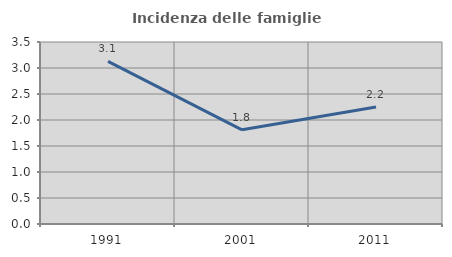
| Category | Incidenza delle famiglie numerose |
|---|---|
| 1991.0 | 3.129 |
| 2001.0 | 1.812 |
| 2011.0 | 2.25 |